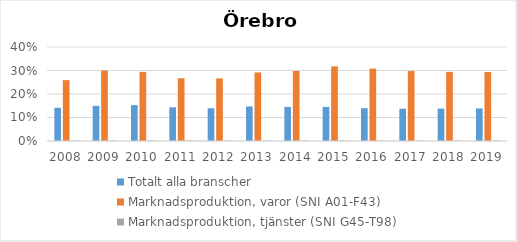
| Category | Totalt alla branscher | Marknadsproduktion, varor (SNI A01-F43) | Marknadsproduktion, tjänster (SNI G45-T98) |
|---|---|---|---|
| 2008 | 0.141 | 0.259 | 0.002 |
| 2009 | 0.15 | 0.3 | 0.002 |
| 2010 | 0.153 | 0.294 | 0.002 |
| 2011 | 0.143 | 0.267 | 0.002 |
| 2012 | 0.139 | 0.267 | 0.002 |
| 2013 | 0.147 | 0.292 | 0.002 |
| 2014 | 0.145 | 0.298 | 0.002 |
| 2015 | 0.145 | 0.318 | 0.002 |
| 2016 | 0.14 | 0.308 | 0.002 |
| 2017 | 0.137 | 0.298 | 0.002 |
| 2018 | 0.138 | 0.294 | 0.002 |
| 2019 | 0.139 | 0.293 | 0.002 |